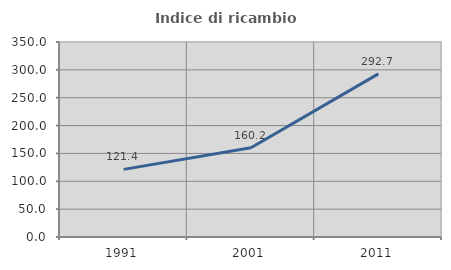
| Category | Indice di ricambio occupazionale  |
|---|---|
| 1991.0 | 121.406 |
| 2001.0 | 160.208 |
| 2011.0 | 292.718 |